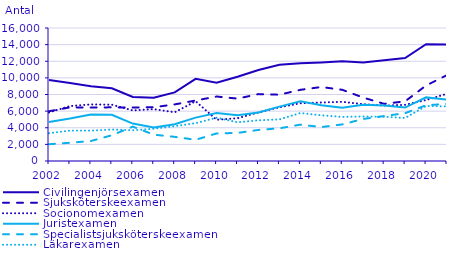
| Category | Civilingenjörsexamen                               | Sjuksköterskeexamen                                | Socionomexamen                                     | Juristexamen                                       | Specialistsjuksköterskeexamen                      | Läkarexamen                                        |
|---|---|---|---|---|---|---|
| 2002.0 | 9746 | 5988 | 5838 | 4695 | 2017 | 3344 |
| 2003.0 | 9394 | 6451 | 6607 | 5116 | 2193 | 3661 |
| 2004.0 | 8998 | 6431 | 6807 | 5599 | 2407 | 3650 |
| 2005.0 | 8755 | 6456 | 6772 | 5560 | 3095 | 3788 |
| 2006.0 | 7711 | 6438 | 6085 | 4499 | 4136 | 3698 |
| 2007.0 | 7616 | 6466 | 6238 | 4042 | 3169 | 3878 |
| 2008.0 | 8249 | 6808 | 5862 | 4432 | 2906 | 4187 |
| 2009.0 | 9889 | 7276 | 7181 | 5218 | 2551 | 4548 |
| 2010.0 | 9407 | 7757 | 4960 | 5769 | 3318 | 5206 |
| 2011.0 | 10127 | 7504 | 5147 | 5497 | 3378 | 4658 |
| 2012.0 | 10948 | 8047 | 5844 | 5826 | 3739 | 4895 |
| 2013.0 | 11568 | 7976 | 6465 | 6543 | 3931 | 5006 |
| 2014.0 | 11750 | 8562 | 6945 | 7174 | 4374 | 5772 |
| 2015.0 | 11848 | 8902 | 7035 | 6715 | 4081 | 5499 |
| 2016.0 | 11992 | 8565 | 7119 | 6417 | 4401 | 5305 |
| 2017.0 | 11843 | 7629 | 6837 | 6774 | 5056 | 5353 |
| 2018.0 | 12129 | 6875 | 6675 | 6686 | 5408 | 5328 |
| 2019.0 | 12392 | 7178 | 6759 | 6425 | 5754 | 5176 |
| 2020.0 | 14042 | 9079 | 7336 | 7652 | 6703 | 6613 |
| 2021.0 | 14012 | 10337 | 8086 | 7376 | 6865 | 6567 |